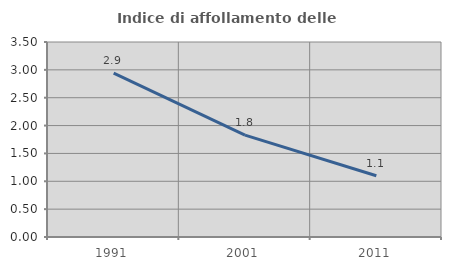
| Category | Indice di affollamento delle abitazioni  |
|---|---|
| 1991.0 | 2.941 |
| 2001.0 | 1.828 |
| 2011.0 | 1.099 |